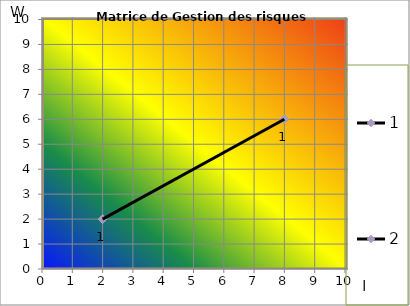
| Category | 1 |
|---|---|
| 2.0 | 2 |
| 8.0 | 6 |